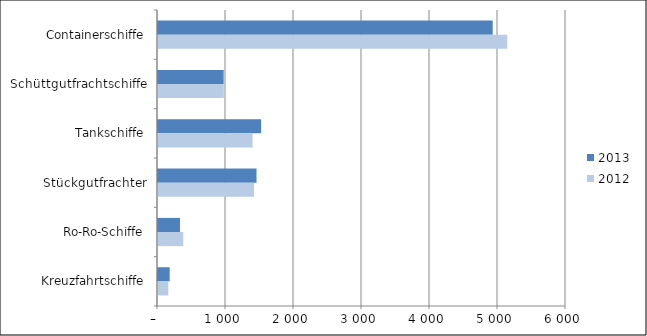
| Category | 2013 | 2012 |
|---|---|---|
| Containerschiffe | 4922 | 5136 |
| Schüttgutfrachtschiffe | 966 | 968 |
| Tankschiffe | 1516 | 1391 |
| Stückgutfrachter | 1449 | 1411 |
| Ro-Ro-Schiffe | 323 | 372 |
| Kreuzfahrtschiffe | 172 | 152 |